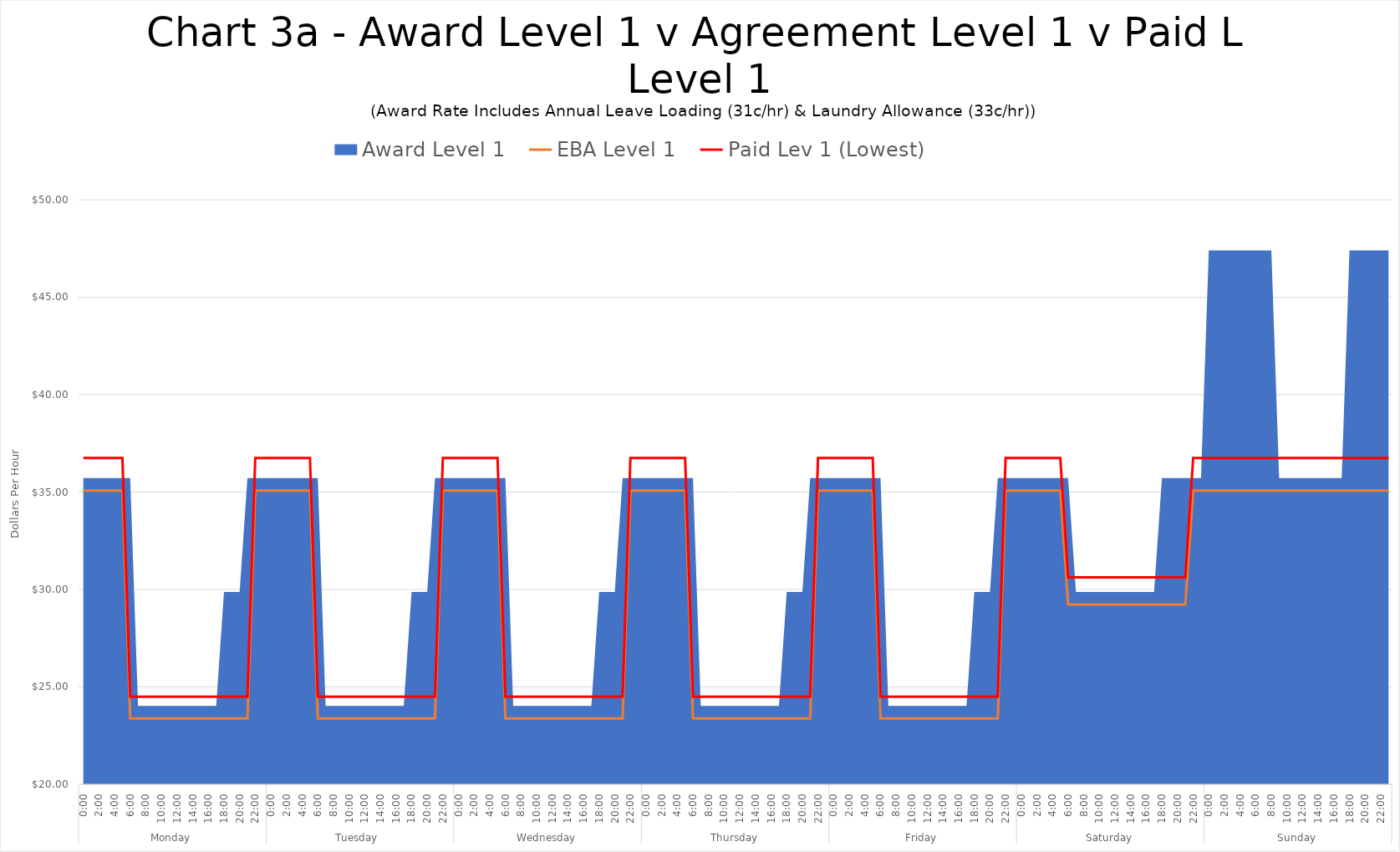
| Category | EBA Level 1 | Paid Lev 1 (Lowest) |
|---|---|---|
| 0 | 35.07 | 36.75 |
| 1 | 35.07 | 36.75 |
| 2 | 35.07 | 36.75 |
| 3 | 35.07 | 36.75 |
| 4 | 35.07 | 36.75 |
| 5 | 35.07 | 36.75 |
| 6 | 23.38 | 24.5 |
| 7 | 23.38 | 24.5 |
| 8 | 23.38 | 24.5 |
| 9 | 23.38 | 24.5 |
| 10 | 23.38 | 24.5 |
| 11 | 23.38 | 24.5 |
| 12 | 23.38 | 24.5 |
| 13 | 23.38 | 24.5 |
| 14 | 23.38 | 24.5 |
| 15 | 23.38 | 24.5 |
| 16 | 23.38 | 24.5 |
| 17 | 23.38 | 24.5 |
| 18 | 23.38 | 24.5 |
| 19 | 23.38 | 24.5 |
| 20 | 23.38 | 24.5 |
| 21 | 23.38 | 24.5 |
| 22 | 35.07 | 36.75 |
| 23 | 35.07 | 36.75 |
| 24 | 35.07 | 36.75 |
| 25 | 35.07 | 36.75 |
| 26 | 35.07 | 36.75 |
| 27 | 35.07 | 36.75 |
| 28 | 35.07 | 36.75 |
| 29 | 35.07 | 36.75 |
| 30 | 23.38 | 24.5 |
| 31 | 23.38 | 24.5 |
| 32 | 23.38 | 24.5 |
| 33 | 23.38 | 24.5 |
| 34 | 23.38 | 24.5 |
| 35 | 23.38 | 24.5 |
| 36 | 23.38 | 24.5 |
| 37 | 23.38 | 24.5 |
| 38 | 23.38 | 24.5 |
| 39 | 23.38 | 24.5 |
| 40 | 23.38 | 24.5 |
| 41 | 23.38 | 24.5 |
| 42 | 23.38 | 24.5 |
| 43 | 23.38 | 24.5 |
| 44 | 23.38 | 24.5 |
| 45 | 23.38 | 24.5 |
| 46 | 35.07 | 36.75 |
| 47 | 35.07 | 36.75 |
| 48 | 35.07 | 36.75 |
| 49 | 35.07 | 36.75 |
| 50 | 35.07 | 36.75 |
| 51 | 35.07 | 36.75 |
| 52 | 35.07 | 36.75 |
| 53 | 35.07 | 36.75 |
| 54 | 23.38 | 24.5 |
| 55 | 23.38 | 24.5 |
| 56 | 23.38 | 24.5 |
| 57 | 23.38 | 24.5 |
| 58 | 23.38 | 24.5 |
| 59 | 23.38 | 24.5 |
| 60 | 23.38 | 24.5 |
| 61 | 23.38 | 24.5 |
| 62 | 23.38 | 24.5 |
| 63 | 23.38 | 24.5 |
| 64 | 23.38 | 24.5 |
| 65 | 23.38 | 24.5 |
| 66 | 23.38 | 24.5 |
| 67 | 23.38 | 24.5 |
| 68 | 23.38 | 24.5 |
| 69 | 23.38 | 24.5 |
| 70 | 35.07 | 36.75 |
| 71 | 35.07 | 36.75 |
| 72 | 35.07 | 36.75 |
| 73 | 35.07 | 36.75 |
| 74 | 35.07 | 36.75 |
| 75 | 35.07 | 36.75 |
| 76 | 35.07 | 36.75 |
| 77 | 35.07 | 36.75 |
| 78 | 23.38 | 24.5 |
| 79 | 23.38 | 24.5 |
| 80 | 23.38 | 24.5 |
| 81 | 23.38 | 24.5 |
| 82 | 23.38 | 24.5 |
| 83 | 23.38 | 24.5 |
| 84 | 23.38 | 24.5 |
| 85 | 23.38 | 24.5 |
| 86 | 23.38 | 24.5 |
| 87 | 23.38 | 24.5 |
| 88 | 23.38 | 24.5 |
| 89 | 23.38 | 24.5 |
| 90 | 23.38 | 24.5 |
| 91 | 23.38 | 24.5 |
| 92 | 23.38 | 24.5 |
| 93 | 23.38 | 24.5 |
| 94 | 35.07 | 36.75 |
| 95 | 35.07 | 36.75 |
| 96 | 35.07 | 36.75 |
| 97 | 35.07 | 36.75 |
| 98 | 35.07 | 36.75 |
| 99 | 35.07 | 36.75 |
| 100 | 35.07 | 36.75 |
| 101 | 35.07 | 36.75 |
| 102 | 23.38 | 24.5 |
| 103 | 23.38 | 24.5 |
| 104 | 23.38 | 24.5 |
| 105 | 23.38 | 24.5 |
| 106 | 23.38 | 24.5 |
| 107 | 23.38 | 24.5 |
| 108 | 23.38 | 24.5 |
| 109 | 23.38 | 24.5 |
| 110 | 23.38 | 24.5 |
| 111 | 23.38 | 24.5 |
| 112 | 23.38 | 24.5 |
| 113 | 23.38 | 24.5 |
| 114 | 23.38 | 24.5 |
| 115 | 23.38 | 24.5 |
| 116 | 23.38 | 24.5 |
| 117 | 23.38 | 24.5 |
| 118 | 35.07 | 36.75 |
| 119 | 35.07 | 36.75 |
| 120 | 35.07 | 36.75 |
| 121 | 35.07 | 36.75 |
| 122 | 35.07 | 36.75 |
| 123 | 35.07 | 36.75 |
| 124 | 35.07 | 36.75 |
| 125 | 35.07 | 36.75 |
| 126 | 29.225 | 30.625 |
| 127 | 29.225 | 30.625 |
| 128 | 29.225 | 30.625 |
| 129 | 29.225 | 30.625 |
| 130 | 29.225 | 30.625 |
| 131 | 29.225 | 30.625 |
| 132 | 29.225 | 30.625 |
| 133 | 29.225 | 30.625 |
| 134 | 29.225 | 30.625 |
| 135 | 29.225 | 30.625 |
| 136 | 29.225 | 30.625 |
| 137 | 29.225 | 30.625 |
| 138 | 29.225 | 30.625 |
| 139 | 29.225 | 30.625 |
| 140 | 29.225 | 30.625 |
| 141 | 29.225 | 30.625 |
| 142 | 35.07 | 36.75 |
| 143 | 35.07 | 36.75 |
| 144 | 35.07 | 36.75 |
| 145 | 35.07 | 36.75 |
| 146 | 35.07 | 36.75 |
| 147 | 35.07 | 36.75 |
| 148 | 35.07 | 36.75 |
| 149 | 35.07 | 36.75 |
| 150 | 35.07 | 36.75 |
| 151 | 35.07 | 36.75 |
| 152 | 35.07 | 36.75 |
| 153 | 35.07 | 36.75 |
| 154 | 35.07 | 36.75 |
| 155 | 35.07 | 36.75 |
| 156 | 35.07 | 36.75 |
| 157 | 35.07 | 36.75 |
| 158 | 35.07 | 36.75 |
| 159 | 35.07 | 36.75 |
| 160 | 35.07 | 36.75 |
| 161 | 35.07 | 36.75 |
| 162 | 35.07 | 36.75 |
| 163 | 35.07 | 36.75 |
| 164 | 35.07 | 36.75 |
| 165 | 35.07 | 36.75 |
| 166 | 35.07 | 36.75 |
| 167 | 35.07 | 36.75 |